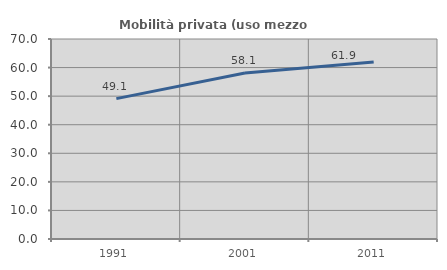
| Category | Mobilità privata (uso mezzo privato) |
|---|---|
| 1991.0 | 49.123 |
| 2001.0 | 58.108 |
| 2011.0 | 61.931 |